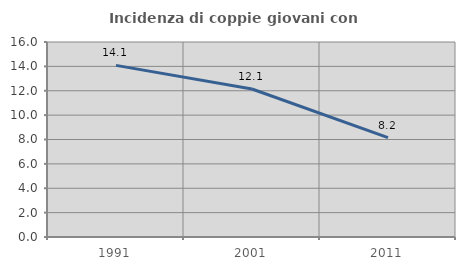
| Category | Incidenza di coppie giovani con figli |
|---|---|
| 1991.0 | 14.083 |
| 2001.0 | 12.146 |
| 2011.0 | 8.15 |